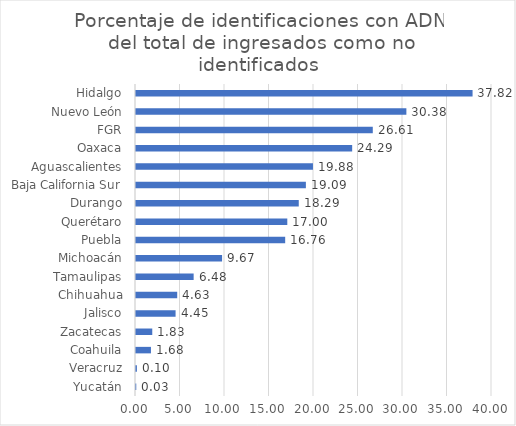
| Category | Porcentaje de identificaciones con ADN del total de ingresados como no identificados |
|---|---|
| Yucatán | 0.03 |
| Veracruz | 0.101 |
| Coahuila | 1.68 |
| Zacatecas | 1.828 |
| Jalisco | 4.447 |
| Chihuahua | 4.63 |
| Tamaulipas | 6.477 |
| Michoacán | 9.671 |
| Puebla | 16.762 |
| Querétaro | 17 |
| Durango | 18.288 |
| Baja California Sur | 19.088 |
| Aguascalientes | 19.883 |
| Oaxaca | 24.289 |
| FGR | 26.606 |
| Nuevo León | 30.379 |
| Hidalgo | 37.817 |